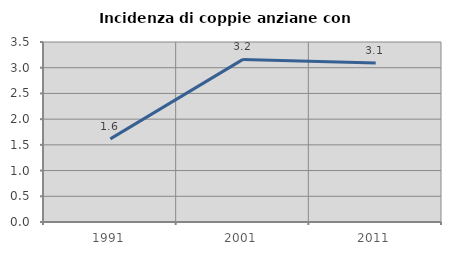
| Category | Incidenza di coppie anziane con figli |
|---|---|
| 1991.0 | 1.617 |
| 2001.0 | 3.162 |
| 2011.0 | 3.091 |